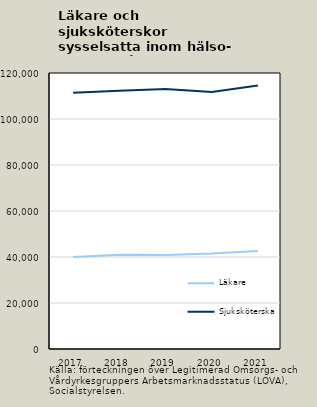
| Category | Läkare | Sjuksköterska |
|---|---|---|
| 2017.0 | 39998 | 111444 |
| 2018.0 | 40927 | 112265 |
| 2019.0 | 40898 | 113031 |
| 2020.0 | 41515 | 111751 |
| 2021.0 | 42627 | 114596 |